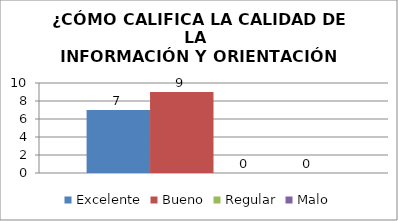
| Category | Excelente | Bueno | Regular | Malo |
|---|---|---|---|---|
| 0 | 7 | 9 | 0 | 0 |